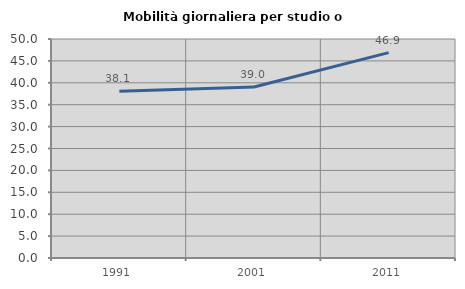
| Category | Mobilità giornaliera per studio o lavoro |
|---|---|
| 1991.0 | 38.079 |
| 2001.0 | 39.034 |
| 2011.0 | 46.891 |